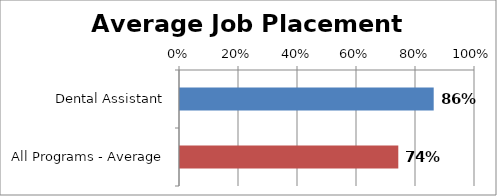
| Category | Series 0 |
|---|---|
| Dental Assistant | 0.86 |
| All Programs - Average | 0.74 |